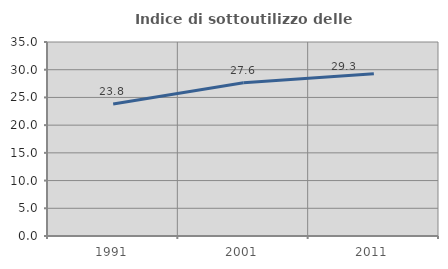
| Category | Indice di sottoutilizzo delle abitazioni  |
|---|---|
| 1991.0 | 23.813 |
| 2001.0 | 27.644 |
| 2011.0 | 29.258 |